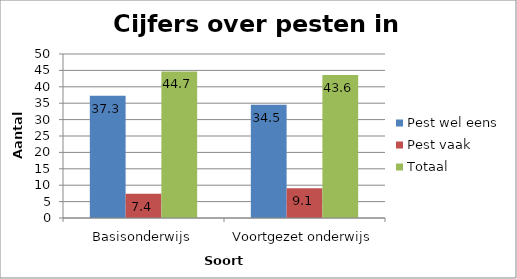
| Category | Pest wel eens | Pest vaak | Totaal |
|---|---|---|---|
| Basisonderwijs | 37.3 | 7.4 | 44.7 |
| Voortgezet onderwijs | 34.5 | 9.1 | 43.6 |